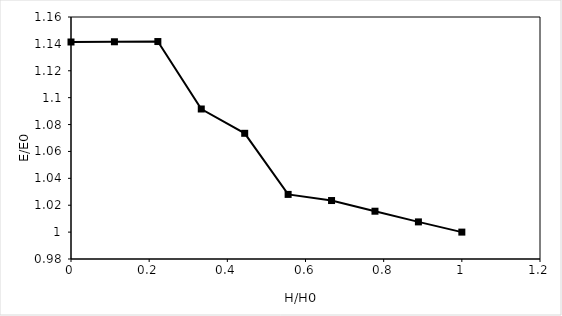
| Category | Head (feet) |
|---|---|
| 1.0 | 1 |
| 0.888888 | 1.008 |
| 0.777776 | 1.016 |
| 0.6666640000000001 | 1.023 |
| 0.5555520000000002 | 1.028 |
| 0.44444000000000017 | 1.073 |
| 0.3333280000000002 | 1.092 |
| 0.2222160000000002 | 1.142 |
| 0.1111040000000002 | 1.142 |
| 0.0 | 1.141 |